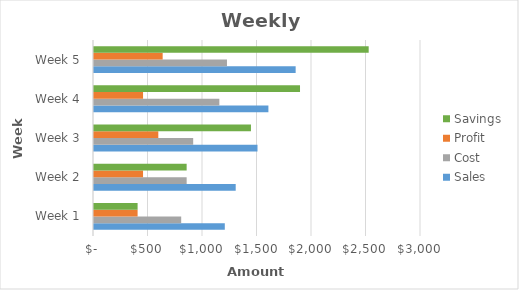
| Category | Sales | Cost | Profit | Savings |
|---|---|---|---|---|
| Week 1 | 1200 | 800 | 400 | 400 |
| Week 2 | 1300 | 850 | 450 | 850 |
| Week 3 | 1500 | 910 | 590 | 1440 |
| Week 4 | 1600 | 1150 | 450 | 1890 |
| Week 5 | 1850 | 1220 | 630 | 2520 |